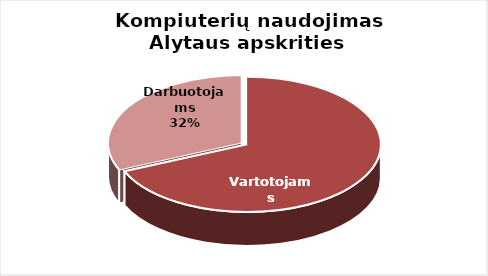
| Category | Series 0 |
|---|---|
| Vartotojams | 456 |
| Darbuotojams | 210 |